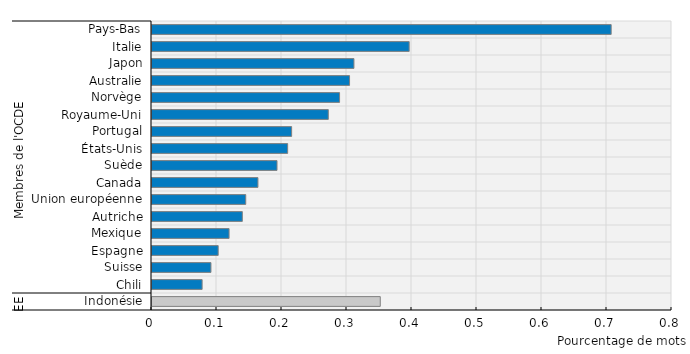
| Category | Series 0 |
|---|---|
| 0 | 0.351 |
| 1 | 0.077 |
| 2 | 0.091 |
| 3 | 0.102 |
| 4 | 0.119 |
| 5 | 0.139 |
| 6 | 0.144 |
| 7 | 0.163 |
| 8 | 0.192 |
| 9 | 0.209 |
| 10 | 0.215 |
| 11 | 0.271 |
| 12 | 0.289 |
| 13 | 0.304 |
| 14 | 0.311 |
| 15 | 0.396 |
| 16 | 0.706 |